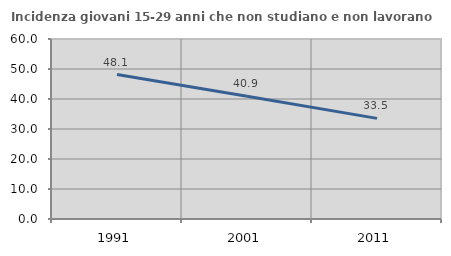
| Category | Incidenza giovani 15-29 anni che non studiano e non lavorano  |
|---|---|
| 1991.0 | 48.148 |
| 2001.0 | 40.914 |
| 2011.0 | 33.54 |